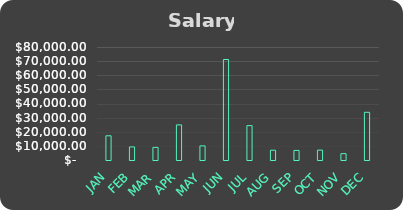
| Category | Series 0 |
|---|---|
| JAN | 17145 |
| FEB | 9261 |
| MAR | 8918 |
| APR | 24849 |
| MAY | 9997 |
| JUN | 71147 |
| JUL | 24341 |
| AUG | 6919 |
| SEP | 6767 |
| OCT | 7009 |
| NOV | 4493 |
| DEC | 33767 |